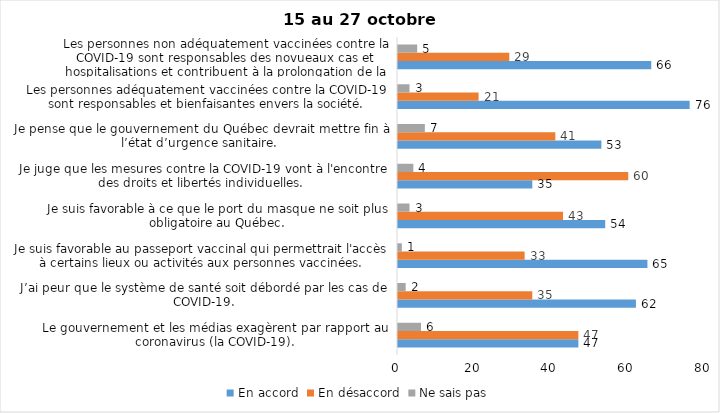
| Category | En accord | En désaccord | Ne sais pas |
|---|---|---|---|
| Le gouvernement et les médias exagèrent par rapport au coronavirus (la COVID-19). | 47 | 47 | 6 |
| J’ai peur que le système de santé soit débordé par les cas de COVID-19. | 62 | 35 | 2 |
| Je suis favorable au passeport vaccinal qui permettrait l'accès à certains lieux ou activités aux personnes vaccinées. | 65 | 33 | 1 |
| Je suis favorable à ce que le port du masque ne soit plus obligatoire au Québec. | 54 | 43 | 3 |
| Je juge que les mesures contre la COVID-19 vont à l'encontre des droits et libertés individuelles.  | 35 | 60 | 4 |
| Je pense que le gouvernement du Québec devrait mettre fin à l’état d’urgence sanitaire.  | 53 | 41 | 7 |
| Les personnes adéquatement vaccinées contre la COVID-19 sont responsables et bienfaisantes envers la société. | 76 | 21 | 3 |
| Les personnes non adéquatement vaccinées contre la COVID-19 sont responsables des novueaux cas et hospitalisations et contribuent à la prolongation de la pandémie au Québec. | 66 | 29 | 5 |